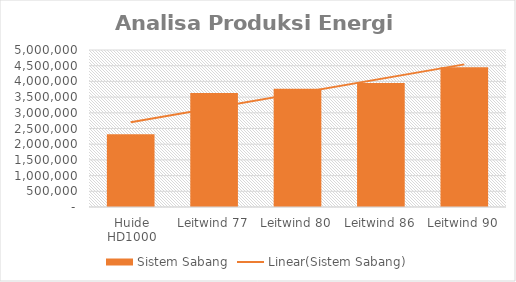
| Category | Sistem Sabang |
|---|---|
| Huide HD1000 | 2313143.571 |
| Leitwind 77 | 3630529.6 |
| Leitwind 80 | 3763130.75 |
| Leitwind 86 | 3952380.25 |
| Leitwind 90 | 4452205 |